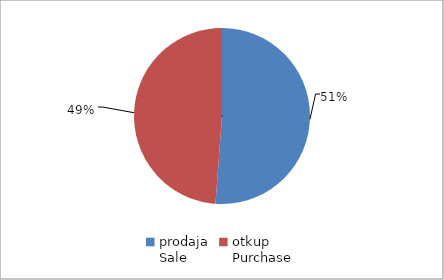
| Category | Series 0 |
|---|---|
| prodaja
Sale | 60241517.86 |
| otkup
Purchase | 57445645.67 |